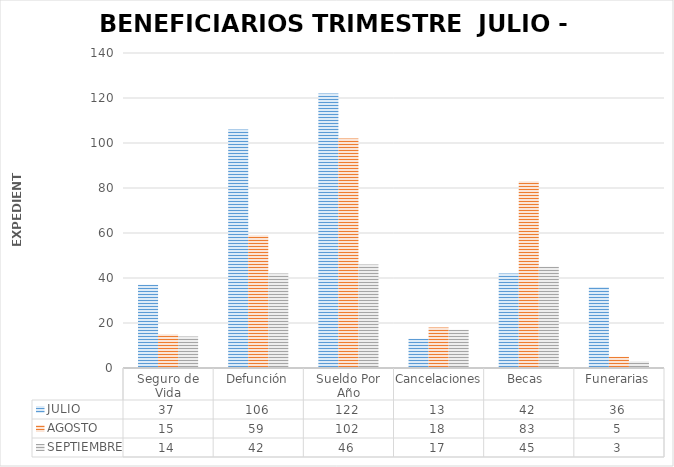
| Category | JULIO | AGOSTO | SEPTIEMBRE |
|---|---|---|---|
| Seguro de Vida | 37 | 15 | 14 |
| Defunción | 106 | 59 | 42 |
| Sueldo Por Año | 122 | 102 | 46 |
| Cancelaciones | 13 | 18 | 17 |
| Becas  | 42 | 83 | 45 |
| Funerarias | 36 | 5 | 3 |